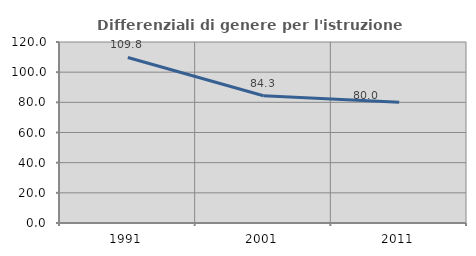
| Category | Differenziali di genere per l'istruzione superiore |
|---|---|
| 1991.0 | 109.756 |
| 2001.0 | 84.347 |
| 2011.0 | 80.033 |